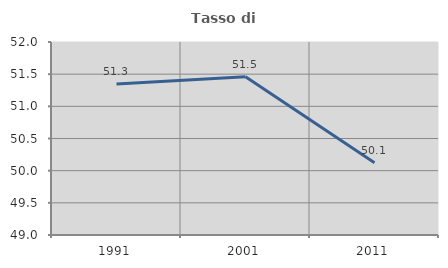
| Category | Tasso di occupazione   |
|---|---|
| 1991.0 | 51.348 |
| 2001.0 | 51.461 |
| 2011.0 | 50.122 |